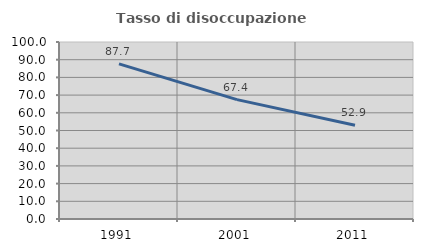
| Category | Tasso di disoccupazione giovanile  |
|---|---|
| 1991.0 | 87.671 |
| 2001.0 | 67.442 |
| 2011.0 | 52.941 |